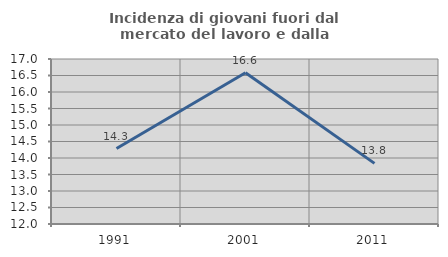
| Category | Incidenza di giovani fuori dal mercato del lavoro e dalla formazione  |
|---|---|
| 1991.0 | 14.286 |
| 2001.0 | 16.583 |
| 2011.0 | 13.836 |